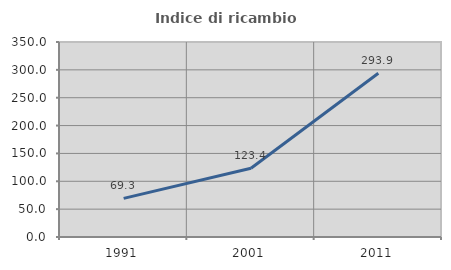
| Category | Indice di ricambio occupazionale  |
|---|---|
| 1991.0 | 69.312 |
| 2001.0 | 123.387 |
| 2011.0 | 293.919 |